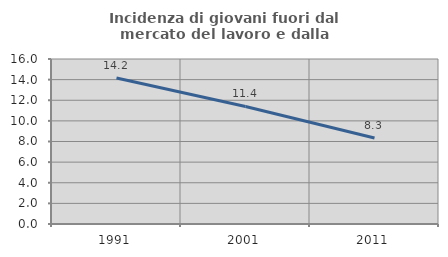
| Category | Incidenza di giovani fuori dal mercato del lavoro e dalla formazione  |
|---|---|
| 1991.0 | 14.164 |
| 2001.0 | 11.397 |
| 2011.0 | 8.333 |